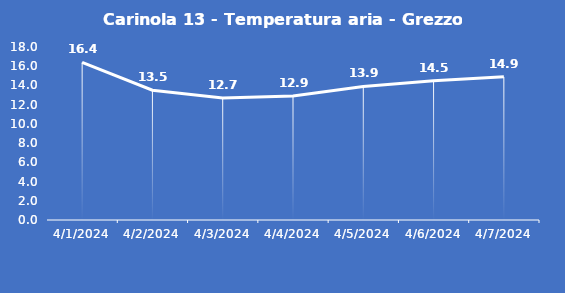
| Category | Carinola 13 - Temperatura aria - Grezzo (°C) |
|---|---|
| 4/1/24 | 16.4 |
| 4/2/24 | 13.5 |
| 4/3/24 | 12.7 |
| 4/4/24 | 12.9 |
| 4/5/24 | 13.9 |
| 4/6/24 | 14.5 |
| 4/7/24 | 14.9 |